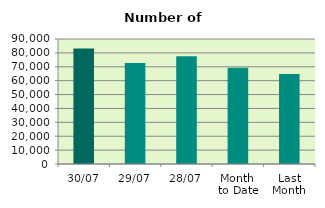
| Category | Series 0 |
|---|---|
| 30/07 | 83250 |
| 29/07 | 72668 |
| 28/07 | 77584 |
| Month 
to Date | 69237.818 |
| Last
Month | 64737.364 |